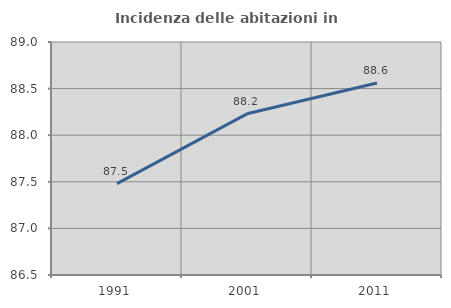
| Category | Incidenza delle abitazioni in proprietà  |
|---|---|
| 1991.0 | 87.48 |
| 2001.0 | 88.23 |
| 2011.0 | 88.56 |